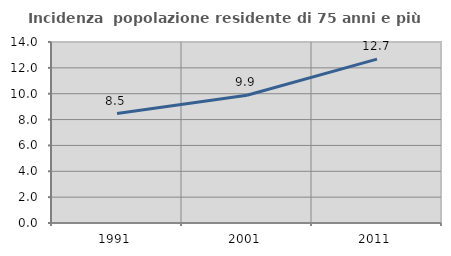
| Category | Incidenza  popolazione residente di 75 anni e più |
|---|---|
| 1991.0 | 8.465 |
| 2001.0 | 9.882 |
| 2011.0 | 12.675 |